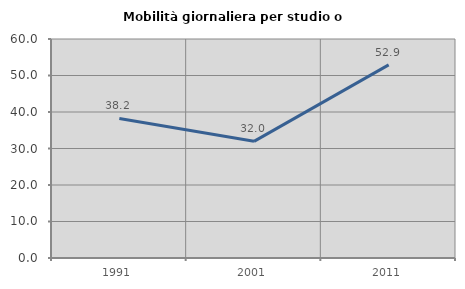
| Category | Mobilità giornaliera per studio o lavoro |
|---|---|
| 1991.0 | 38.23 |
| 2001.0 | 31.961 |
| 2011.0 | 52.921 |